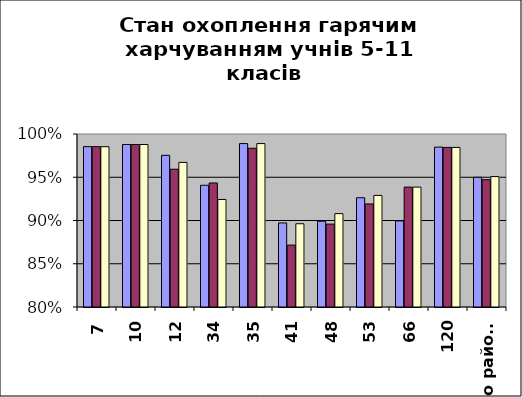
| Category | Series 0 | Series 1 | Series 2 |
|---|---|---|---|
| 7 | 0.985 | 0.985 | 0.985 |
| 10 | 0.988 | 0.988 | 0.988 |
| 12 | 0.975 | 0.959 | 0.967 |
| 34 | 0.941 | 0.943 | 0.924 |
| 35 | 0.989 | 0.984 | 0.989 |
| 41 | 0.897 | 0.872 | 0.896 |
| 48 | 0.899 | 0.896 | 0.908 |
| 53 | 0.926 | 0.919 | 0.929 |
| 66 | 0.9 | 0.939 | 0.939 |
| 120 | 0.985 | 0.984 | 0.984 |
| по району | 0.95 | 0.947 | 0.951 |